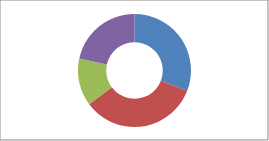
| Category | Series 0 |
|---|---|
| Cash | 50 |
| Investments | 55 |
| Retirement | 22 |
| Property | 35 |